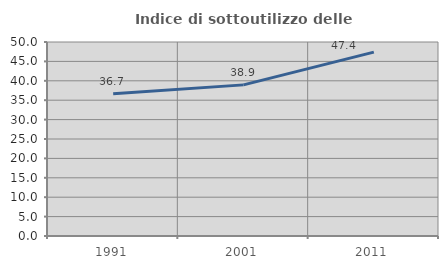
| Category | Indice di sottoutilizzo delle abitazioni  |
|---|---|
| 1991.0 | 36.663 |
| 2001.0 | 38.95 |
| 2011.0 | 47.379 |